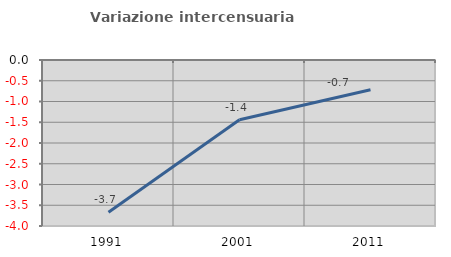
| Category | Variazione intercensuaria annua |
|---|---|
| 1991.0 | -3.668 |
| 2001.0 | -1.442 |
| 2011.0 | -0.715 |